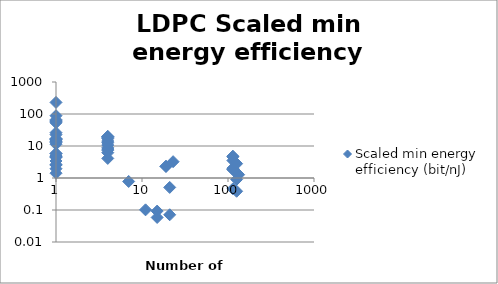
| Category | Scaled min energy efficiency (bit/nJ) |
|---|---|
| 107.0 | 0 |
| 114.0 | 4.806 |
| 19.0 | 2.308 |
| 133.0 | 1.269 |
| 114.0 | 0.458 |
| 7.0 | 0.78 |
| 12.0 | 0 |
| 114.0 | 0 |
| 114.0 | 0 |
| 11.0 | 0 |
| 11.0 | 0 |
| 11.0 | 0 |
| 21.0 | 0.507 |
| 11.0 | 0 |
| 11.0 | 0.101 |
| 5.0 | 0 |
| 21.0 | 0.071 |
| 15.0 | 0.092 |
| 15.0 | 0.058 |
| 21.0 | 0 |
| 11.0 | 0 |
| 5.0 | 0 |
| 1.0 | 0 |
| 12.0 | 0 |
| 1.0 | 0 |
| 114.0 | 2.022 |
| 126.0 | 0.903 |
| 126.0 | 0.385 |
| 126.0 | 2.807 |
| 1.0 | 13.771 |
| 126.0 | 0 |
| 1.0 | 0 |
| 114.0 | 0 |
| 19.0 | 2.317 |
| 1.0 | 4.391 |
| 1.0 | 22.607 |
| 1.0 | 16.165 |
| 1.0 | 16.711 |
| 1.0 | 12.909 |
| 1.0 | 16.136 |
| 1.0 | 1.947 |
| 1.0 | 5.879 |
| 1.0 | 4.849 |
| 1.0 | 4.885 |
| 1.0 | 4.543 |
| 1.0 | 4.766 |
| 1.0 | 0 |
| 1.0 | 0 |
| 1.0 | 0 |
| 1.0 | 0 |
| 1.0 | 0 |
| 1.0 | 65.999 |
| 4.0 | 12.657 |
| 4.0 | 0 |
| 4.0 | 7.406 |
| 4.0 | 8.749 |
| 4.0 | 4.086 |
| 4.0 | 6.185 |
| 1.0 | 0 |
| 4.0 | 19.728 |
| 1.0 | 88.496 |
| 1.0 | 53.191 |
| 114.0 | 0 |
| 12.0 | 0 |
| 23.0 | 3.235 |
| 114.0 | 1.823 |
| 114.0 | 3.518 |
| 1.0 | 2.648 |
| 1.0 | 2.528 |
| 1.0 | 3.401 |
| 1.0 | 17.036 |
| 1.0 | 14.376 |
| 6.0 | 0 |
| 114.0 | 1.897 |
| 114.0 | 4.591 |
| 4.0 | 19.855 |
| 4.0 | 16.948 |
| 1.0 | 1.41 |
| 12.0 | 0 |
| 1.0 | 5.748 |
| 4.0 | 18.333 |
| 4.0 | 8.019 |
| 4.0 | 14.286 |
| 1.0 | 11.388 |
| 1.0 | 26.1 |
| 1.0 | 57.449 |
| 1.0 | 61.519 |
| 4.0 | 10.711 |
| 1.0 | 229.994 |